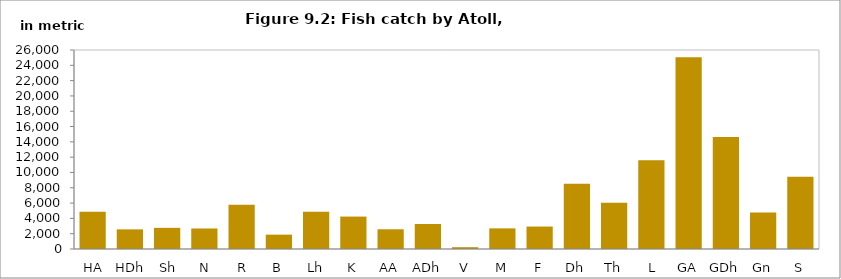
| Category | Series 0 |
|---|---|
|  HA | 4852.28 |
|  HDh | 2565.653 |
|  Sh | 2763.444 |
|  N | 2682.097 |
|  R | 5775.381 |
| B | 1874.863 |
| Lh | 4853.972 |
| K | 4236.694 |
| AA | 2576.609 |
| ADh | 3269.668 |
| V | 234.807 |
| M | 2694.534 |
| F | 2932.485 |
| Dh | 8530.429 |
| Th | 6049.48 |
|  L | 11585.482 |
| GA | 25065.137 |
| GDh | 14621.352 |
| Gn | 4762.431 |
| S | 9447.908 |